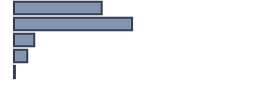
| Category | Percentatge |
|---|---|
| 0 | 36.535 |
| 1 | 49.186 |
| 2 | 8.429 |
| 3 | 5.473 |
| 4 | 0.378 |